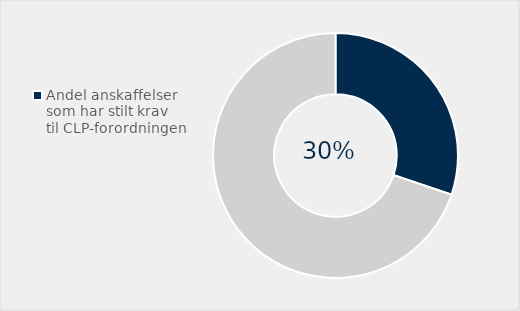
| Category | Series 0 |
|---|---|
| Andel anskaffelser som har stilt krav til CLP-forordningen | 0.302 |
| Ikke brukt  | 0.698 |